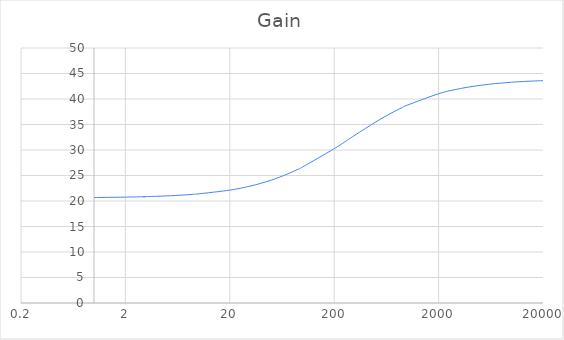
| Category | Series 0 |
|---|---|
| 1.0 | 20.678 |
| 2.0 | 20.76 |
| 3.0 | 20.841 |
| 3.0 | 20.841 |
| 4.0 | 20.921 |
| 5.0 | 21.001 |
| 6.0 | 21.081 |
| 7.0 | 21.159 |
| 8.0 | 21.238 |
| 9.0 | 21.315 |
| 10.0 | 21.393 |
| 20.0 | 22.137 |
| 30.0 | 22.833 |
| 40.0 | 23.486 |
| 50.0 | 24.1 |
| 60.0 | 24.679 |
| 70.0 | 25.224 |
| 80.0 | 25.739 |
| 90.0 | 26.227 |
| 100.0 | 26.689 |
| 200.0 | 30.259 |
| 300.0 | 32.604 |
| 400.0 | 34.262 |
| 500.0 | 35.496 |
| 600.0 | 36.451 |
| 700.0 | 37.211 |
| 800.0 | 37.831 |
| 900.0 | 38.346 |
| 1000.0 | 38.781 |
| 2000.0 | 41.035 |
| 3000.0 | 41.915 |
| 4000.0 | 42.384 |
| 5000.0 | 42.676 |
| 6000.0 | 42.875 |
| 7000.0 | 43.019 |
| 8000.0 | 43.129 |
| 9000.0 | 43.214 |
| 10000.0 | 43.283 |
| 11000.0 | 43.34 |
| 12000.0 | 43.388 |
| 13000.0 | 43.428 |
| 14000.0 | 43.463 |
| 15000.0 | 43.493 |
| 16000.0 | 43.52 |
| 17000.0 | 43.543 |
| 18000.0 | 43.564 |
| 19000.0 | 43.583 |
| 20000.0 | 43.6 |